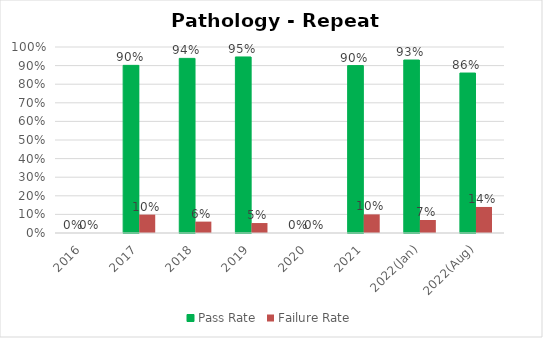
| Category | Pass Rate | Failure Rate |
|---|---|---|
| 2016 | 0 | 0 |
| 2017 | 0.901 | 0.099 |
| 2018 | 0.939 | 0.061 |
| 2019 | 0.946 | 0.054 |
| 2020 | 0 | 0 |
| 2021 | 0.9 | 0.1 |
| 2022(Jan) | 0.93 | 0.07 |
| 2022(Aug) | 0.86 | 0.14 |